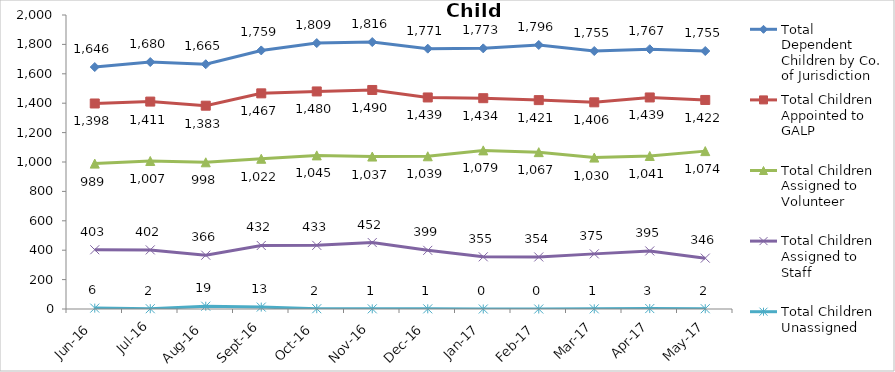
| Category | Total Dependent Children by Co. of Jurisdiction | Total Children Appointed to GALP | Total Children Assigned to Volunteer | Total Children Assigned to Staff | Total Children Unassigned |
|---|---|---|---|---|---|
| Jun-16 | 1646 | 1398 | 989 | 403 | 6 |
| Jul-16 | 1680 | 1411 | 1007 | 402 | 2 |
| Aug-16 | 1665 | 1383 | 998 | 366 | 19 |
| Sep-16 | 1759 | 1467 | 1022 | 432 | 13 |
| Oct-16 | 1809 | 1480 | 1045 | 433 | 2 |
| Nov-16 | 1816 | 1490 | 1037 | 452 | 1 |
| Dec-16 | 1771 | 1439 | 1039 | 399 | 1 |
| Jan-17 | 1773 | 1434 | 1079 | 355 | 0 |
| Feb-17 | 1796 | 1421 | 1067 | 354 | 0 |
| Mar-17 | 1755 | 1406 | 1030 | 375 | 1 |
| Apr-17 | 1767 | 1439 | 1041 | 395 | 3 |
| May-17 | 1755 | 1422 | 1074 | 346 | 2 |